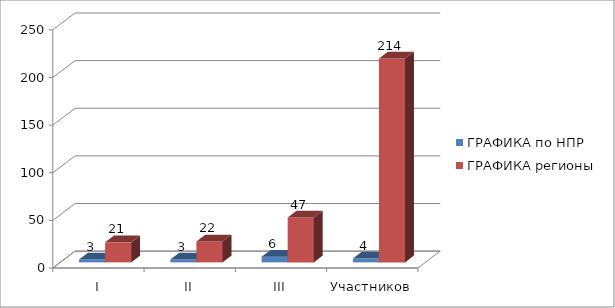
| Category | ГРАФИКА по НПР | ГРАФИКА регионы |
|---|---|---|
| I | 3 | 21 |
| II | 3 | 22 |
| III | 6 | 47 |
| Участников | 4 | 214 |